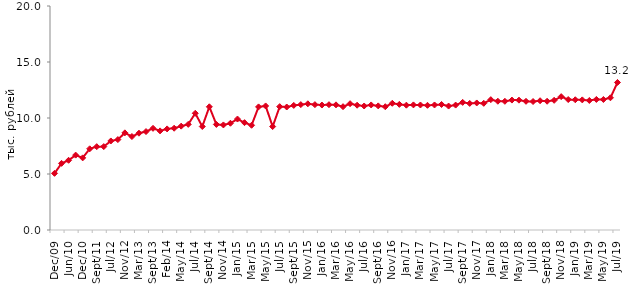
| Category | медианное значение среднедушевого располагаемого дохода, тыс. руб. |
|---|---|
| 2009-12-01 | 5.058 |
| 2010-04-01 | 5.949 |
| 2010-06-01 | 6.224 |
| 2010-09-01 | 6.686 |
| 2010-12-01 | 6.44 |
| 2011-07-01 | 7.25 |
| 2011-09-01 | 7.441 |
| 2011-12-01 | 7.446 |
| 2012-07-01 | 7.95 |
| 2012-09-01 | 8.071 |
| 2012-11-01 | 8.673 |
| 2012-12-01 | 8.345 |
| 2013-03-01 | 8.644 |
| 2013-06-01 | 8.789 |
| 2013-09-01 | 9.079 |
| 2013-12-01 | 8.849 |
| 2014-02-01 | 9.025 |
| 2014-04-01 | 9.087 |
| 2014-05-01 | 9.273 |
| 2014-06-01 | 9.432 |
| 2014-07-01 | 10.422 |
| 2014-08-01 | 9.241 |
| 2014-09-01 | 11 |
| 2014-10-01 | 9.426 |
| 2014-11-01 | 9.381 |
| 2014-12-01 | 9.532 |
| 2015-01-01 | 9.908 |
| 2015-02-01 | 9.585 |
| 2015-03-01 | 9.35 |
| 2015-04-01 | 10.991 |
| 2015-05-01 | 11.076 |
| 2015-06-01 | 9.237 |
| 2015-07-01 | 11.013 |
| 2015-08-01 | 10.981 |
| 2015-09-01 | 11.124 |
| 2015-10-01 | 11.195 |
| 2015-11-01 | 11.268 |
| 2015-12-01 | 11.194 |
| 2016-01-01 | 11.158 |
| 2016-02-01 | 11.188 |
| 2016-03-01 | 11.174 |
| 2016-04-01 | 11.01 |
| 2016-05-01 | 11.278 |
| 2016-06-01 | 11.142 |
| 2016-07-01 | 11.072 |
| 2016-08-01 | 11.165 |
| 2016-09-01 | 11.082 |
| 2016-10-01 | 11.008 |
| 2016-11-01 | 11.313 |
| 2016-12-01 | 11.216 |
| 2017-01-01 | 11.146 |
| 2017-02-01 | 11.17 |
| 2017-03-01 | 11.162 |
| 2017-04-01 | 11.133 |
| 2017-05-01 | 11.163 |
| 2017-06-01 | 11.207 |
| 2017-07-01 | 11.066 |
| 2017-08-01 | 11.153 |
| 2017-09-01 | 11.395 |
| 2017-10-01 | 11.301 |
| 2017-11-01 | 11.342 |
| 2017-12-01 | 11.31 |
| 2018-01-01 | 11.637 |
| 2018-02-01 | 11.497 |
| 2018-03-01 | 11.49 |
| 2018-04-01 | 11.601 |
| 2018-05-01 | 11.592 |
| 2018-06-01 | 11.491 |
| 2018-07-01 | 11.471 |
| 2018-08-01 | 11.541 |
| 2018-09-01 | 11.497 |
| 2018-10-01 | 11.578 |
| 2018-11-01 | 11.906 |
| 2018-12-01 | 11.648 |
| 2019-01-01 | 11.629 |
| 2019-02-01 | 11.617 |
| 2019-03-01 | 11.566 |
| 2019-04-01 | 11.659 |
| 2019-05-01 | 11.653 |
| 2019-06-01 | 11.805 |
| 2019-07-01 | 13.174 |